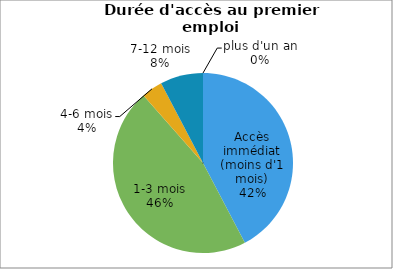
| Category | Promotion 2008 |
|---|---|
| Accès immédiat (moins d'1 mois) | 0.423 |
| 1-3 mois | 0.462 |
| 4-6 mois | 0.038 |
| 7-12 mois | 0.077 |
| plus d'un an | 0 |